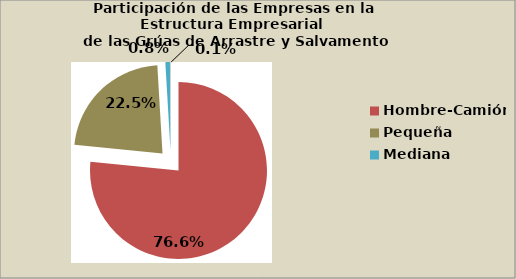
| Category | Series 0 |
|---|---|
| Hombre-Camión | 76.615 |
| Pequeña | 22.509 |
| Mediana | 0.834 |
| Grande | 0.1 |